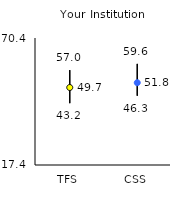
| Category | 25th | 75th | Mean |
|---|---|---|---|
| TFS | 43.2 | 57 | 49.74 |
| CSS | 46.3 | 59.6 | 51.75 |